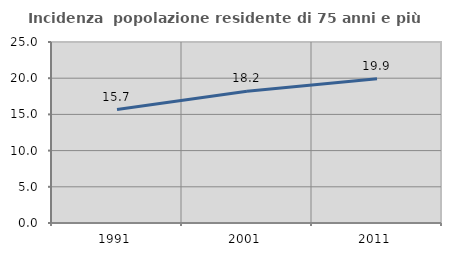
| Category | Incidenza  popolazione residente di 75 anni e più |
|---|---|
| 1991.0 | 15.67 |
| 2001.0 | 18.199 |
| 2011.0 | 19.93 |